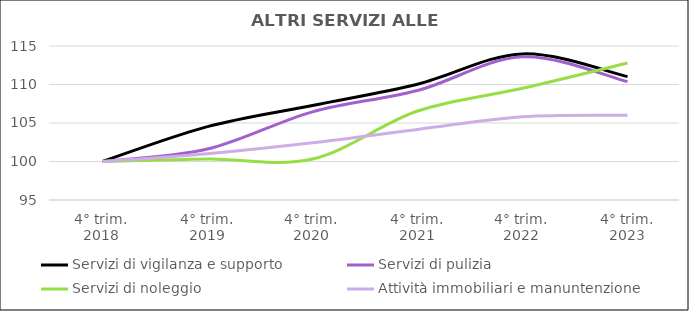
| Category | Servizi di vigilanza e supporto | Servizi di pulizia | Servizi di noleggio  | Attività immobiliari e manuntenzione  |
|---|---|---|---|---|
| 4° trim.
2018 | 100 | 100 | 100 | 100 |
| 4° trim.
2019 | 104.528 | 101.613 | 100.328 | 101.016 |
| 4° trim.
2020 | 107.283 | 106.452 | 100.328 | 102.436 |
| 4° trim.
2021 | 110.039 | 109.217 | 106.557 | 104.169 |
| 4° trim.
2022 | 113.976 | 113.594 | 109.508 | 105.813 |
| 4° trim.
2023 | 111.024 | 110.369 | 112.787 | 106.007 |